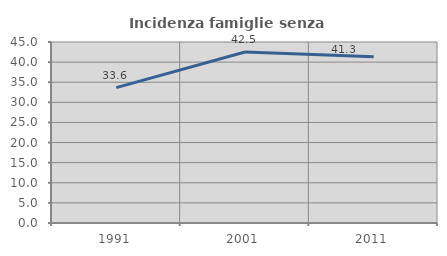
| Category | Incidenza famiglie senza nuclei |
|---|---|
| 1991.0 | 33.645 |
| 2001.0 | 42.5 |
| 2011.0 | 41.304 |